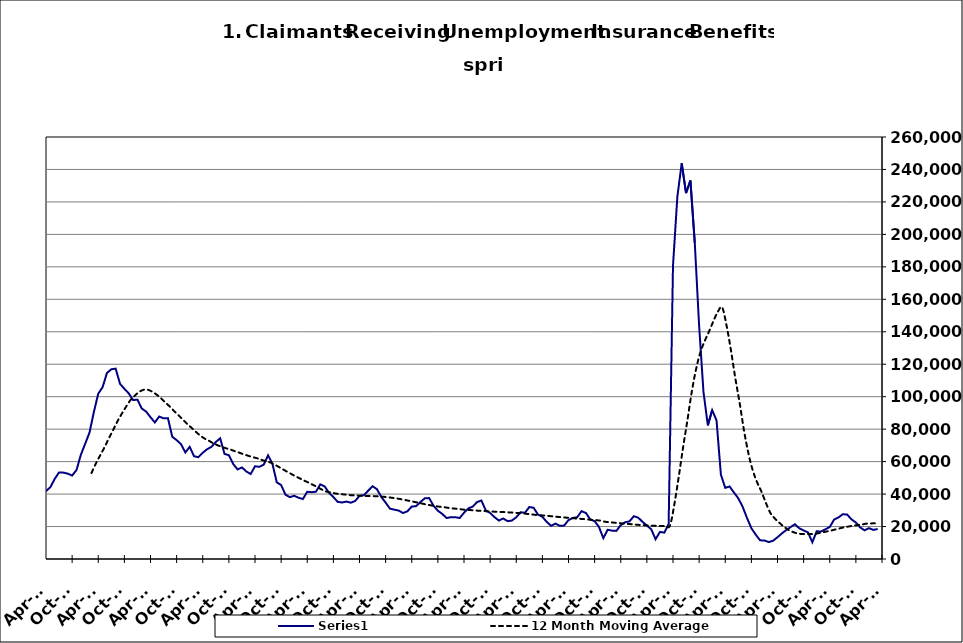
| Category | Series 0 |
|---|---|
| 2000-01-31 | 15239 |
| 2000-02-29 | 13995 |
| 2000-03-31 | 14536 |
| 2000-04-30 | 18337 |
| 2000-05-31 | 20863 |
| 2000-06-30 | 24310 |
| 2000-07-31 | 29359 |
| 2000-08-31 | 29764 |
| 2000-09-30 | 24540 |
| 2000-10-31 | 23067 |
| 2000-11-30 | 21129 |
| 2000-12-31 | 20288 |
| 2001-01-31 | 23646 |
| 2001-02-28 | 23782 |
| 2001-03-31 | 27047 |
| 2001-04-30 | 34048 |
| 2001-05-31 | 38168 |
| 2001-06-30 | 41894 |
| 2001-07-31 | 48114 |
| 2001-08-31 | 47646 |
| 2001-09-30 | 44132 |
| 2001-10-31 | 44465 |
| 2001-11-30 | 45928 |
| 2001-12-31 | 48930 |
| 2002-01-31 | 51864 |
| 2002-02-28 | 50778 |
| 2002-03-31 | 53014 |
| 2002-04-30 | 65394 |
| 2002-05-31 | 67925 |
| 2002-06-30 | 68727 |
| 2002-07-31 | 67269 |
| 2002-08-31 | 64233 |
| 2002-09-30 | 59955 |
| 2002-10-31 | 55535 |
| 2002-11-30 | 52233 |
| 2002-12-31 | 52252 |
| 2003-01-31 | 52694 |
| 2003-02-28 | 52578 |
| 2003-03-31 | 56236 |
| 2003-04-30 | 61020 |
| 2003-05-31 | 60584 |
| 2003-06-30 | 64980 |
| 2003-07-31 | 66426 |
| 2003-08-31 | 65403 |
| 2003-09-30 | 58348 |
| 2003-10-31 | 53953 |
| 2003-11-30 | 50453 |
| 2003-12-31 | 47799 |
| 2004-01-31 | 47134 |
| 2004-02-29 | 42441 |
| 2004-03-31 | 39363 |
| 2004-04-30 | 41157 |
| 2004-05-31 | 40892 |
| 2004-06-30 | 43601 |
| 2004-07-31 | 45411 |
| 2004-08-31 | 44738 |
| 2004-09-30 | 36049 |
| 2004-10-31 | 33551 |
| 2004-11-30 | 31386 |
| 2004-12-31 | 30195 |
| 2005-01-31 | 31661 |
| 2005-02-28 | 28205 |
| 2005-03-31 | 28194 |
| 2005-04-30 | 31233 |
| 2005-05-31 | 24184 |
| 2005-06-30 | 33525 |
| 2005-07-31 | 35776 |
| 2005-08-31 | 33297 |
| 2005-09-30 | 27423 |
| 2005-10-31 | 25647 |
| 2005-11-30 | 21039 |
| 2005-12-31 | 21238 |
| 2006-01-31 | 22270 |
| 2006-02-28 | 19689 |
| 2006-03-31 | 19474 |
| 2006-04-30 | 22420 |
| 2006-05-31 | 24146 |
| 2006-06-30 | 26450 |
| 2006-07-31 | 30575 |
| 2006-08-31 | 30038 |
| 2006-09-30 | 25657 |
| 2006-10-31 | 24869 |
| 2006-11-30 | 22832 |
| 2006-12-31 | 22826 |
| 2007-01-31 | 24459 |
| 2007-02-28 | 23856 |
| 2007-03-31 | 24786 |
| 2007-04-30 | 29690 |
| 2007-05-31 | 31303 |
| 2007-06-30 | 33512 |
| 2007-07-31 | 39176 |
| 2007-08-31 | 37077 |
| 2007-09-30 | 34179 |
| 2007-10-31 | 32130 |
| 2007-11-15 | 31205 |
| 2007-12-15 09:36:00 | 31973 |
| 2008-01-14 19:12:00 | 33494 |
| 2008-02-14 04:48:00 | 34694 |
| 2008-03-15 14:24:00 | 37279 |
| 2008-04-15 | 41840 |
| 2008-05-15 09:36:00 | 44245 |
| 2008-06-14 19:12:00 | 49341 |
| 2008-07-15 04:48:00 | 53353 |
| 2008-08-14 14:24:00 | 53222 |
| 2008-09-14 | 52594 |
| 2008-10-14 09:36:00 | 51417 |
| 2008-11-13 19:12:00 | 54795 |
| 2008-12-14 04:48:00 | 64139 |
| 2009-01-13 14:24:00 | 71026 |
| 2009-02-13 | 77947 |
| 2009-03-15 09:36:00 | 90649 |
| 2009-04-14 19:12:00 | 101865 |
| 2009-05-15 04:48:00 | 105867 |
| 2009-06-14 14:24:00 | 114626 |
| 2009-07-15 | 116882 |
| 2009-08-14 09:36:00 | 117270 |
| 2009-09-13 19:12:00 | 107943 |
| 2009-10-14 04:48:00 | 104849 |
| 2009-11-13 14:24:00 | 102065 |
| 2009-12-14 | 97917 |
| 2010-01-13 09:36:00 | 98175 |
| 2010-02-12 19:12:00 | 92691 |
| 2010-03-15 04:48:00 | 90832 |
| 2010-04-14 14:24:00 | 87347 |
| 2010-05-15 | 84120 |
| 2010-06-14 09:36:00 | 87787 |
| 2010-07-14 19:12:00 | 86654 |
| 2010-08-14 04:48:00 | 86789 |
| 2010-09-13 14:24:00 | 75317 |
| 2010-10-14 | 73259 |
| 2010-11-13 09:36:00 | 70783 |
| 2010-12-13 19:12:00 | 65644 |
| 2011-01-13 04:48:00 | 69106 |
| 2011-02-12 14:24:00 | 63322 |
| 2011-03-15 | 62724 |
| 2011-04-14 09:36:00 | 65434 |
| 2011-05-14 19:12:00 | 67641 |
| 2011-06-14 04:48:00 | 69087 |
| 2011-07-14 14:24:00 | 72082 |
| 2011-08-14 | 74376 |
| 2011-09-13 09:36:00 | 64739 |
| 2011-10-13 19:12:00 | 63965 |
| 2011-11-13 04:48:00 | 58496 |
| 2011-12-13 14:24:00 | 55173 |
| 2012-01-13 | 56418 |
| 2012-02-12 09:36:00 | 53942 |
| 2012-03-13 19:12:00 | 52352 |
| 2012-04-13 04:48:00 | 57118 |
| 2012-05-13 14:24:00 | 56827 |
| 2012-06-13 | 58115 |
| 2012-07-13 09:36:00 | 63863 |
| 2012-08-12 19:12:00 | 58706 |
| 2012-09-12 04:48:00 | 47243 |
| 2012-10-12 14:24:00 | 45567 |
| 2012-11-12 | 39623 |
| 2012-12-12 09:36:00 | 38101 |
| 2013-01-11 19:12:00 | 38966 |
| 2013-02-11 04:48:00 | 37746 |
| 2013-03-13 14:24:00 | 36956 |
| 2013-04-13 | 41439 |
| 2013-05-13 09:36:00 | 41162 |
| 2013-06-12 19:12:00 | 41455 |
| 2013-07-13 04:48:00 | 45989 |
| 2013-08-12 14:24:00 | 44712 |
| 2013-09-12 | 40828 |
| 2013-10-12 09:36:00 | 38185 |
| 2013-11-11 19:12:00 | 35184 |
| 2013-12-12 04:48:00 | 34824 |
| 2014-01-11 14:24:00 | 35396 |
| 2014-02-11 | 34683 |
| 2014-03-13 09:36:00 | 35748 |
| 2014-04-12 19:12:00 | 38892 |
| 2014-05-13 04:48:00 | 39325 |
| 2014-06-12 14:24:00 | 42091 |
| 2014-07-13 | 44842 |
| 2014-08-14 | 43016 |
| 2014-09-13 09:36:00 | 38304 |
| 2014-10-13 19:12:00 | 34708 |
| 2014-11-13 04:48:00 | 31017 |
| 2014-12-13 14:24:00 | 30402 |
| 2015-01-13 | 29823 |
| 2015-02-12 09:36:00 | 28333 |
| 2015-03-14 19:12:00 | 29389 |
| 2015-04-14 04:48:00 | 32293 |
| 2015-05-14 14:24:00 | 32538 |
| 2015-06-14 | 35137 |
| 2015-07-14 09:36:00 | 37398 |
| 2015-08-13 19:12:00 | 37536 |
| 2015-09-13 04:48:00 | 32808 |
| 2015-10-13 14:24:00 | 29728 |
| 2015-11-13 | 27775 |
| 2015-12-13 09:36:00 | 25227 |
| 2016-01-12 19:12:00 | 25773 |
| 2016-02-12 04:48:00 | 25758 |
| 2016-03-13 14:24:00 | 25247 |
| 2016-04-13 | 28463 |
| 2016-05-13 09:36:00 | 31210 |
| 2016-06-12 19:12:00 | 32255 |
| 2016-07-13 04:48:00 | 35088 |
| 2016-08-12 14:24:00 | 36018 |
| 2016-09-12 | 29922 |
| 2016-10-12 09:36:00 | 28368 |
| 2016-11-11 19:12:00 | 25818 |
| 2016-12-12 04:48:00 | 23690 |
| 2017-01-11 14:24:00 | 24964 |
| 2017-02-11 | 23348 |
| 2017-03-13 09:36:00 | 23685 |
| 2017-04-12 19:12:00 | 25733 |
| 2017-05-13 04:48:00 | 28796 |
| 2017-06-12 14:24:00 | 28489 |
| 2017-07-13 | 32034 |
| 2017-08-12 09:36:00 | 31539 |
| 2017-09-11 19:12:00 | 27321 |
| 2017-10-12 04:48:00 | 25990 |
| 2017-11-11 14:24:00 | 22875 |
| 2017-12-12 | 20445 |
| 2018-01-11 09:36:00 | 21794 |
| 2018-02-10 19:12:00 | 20475 |
| 2018-03-13 04:48:00 | 20585 |
| 2018-04-12 14:24:00 | 23969 |
| 2018-05-13 | 25280 |
| 2018-06-12 09:36:00 | 25741 |
| 2018-07-12 19:12:00 | 29479 |
| 2018-08-12 04:48:00 | 28351 |
| 2018-09-11 14:24:00 | 24386 |
| 2018-10-12 | 23292 |
| 2018-11-11 09:36:00 | 19711 |
| 2018-12-11 19:12:00 | 12853 |
| 2019-01-11 04:48:00 | 18039 |
| 2019-02-10 14:24:00 | 17466 |
| 2019-03-13 | 17325 |
| 2019-04-12 09:36:00 | 20890 |
| 2019-05-12 19:12:00 | 22641 |
| 2019-06-12 04:48:00 | 23178 |
| 2019-07-12 14:24:00 | 26385 |
| 2019-08-12 | 25501 |
| 2019-09-11 09:36:00 | 22892 |
| 2019-10-11 19:12:00 | 20585 |
| 2019-11-11 04:48:00 | 18323 |
| 2019-12-11 14:24:00 | 12174 |
| 2020-01-11 | 16684 |
| 2020-02-10 09:36:00 | 16260 |
| 2020-03-11 19:12:00 | 21667 |
| 2020-04-11 04:48:00 | 180666 |
| 2020-05-11 14:24:00 | 223189 |
| 2020-06-11 | 243809 |
| 2020-07-11 09:36:00 | 225469 |
| 2020-08-10 19:12:00 | 233220 |
| 2020-09-10 04:48:00 | 194839 |
| 2020-10-10 14:24:00 | 143722 |
| 2020-11-10 | 102967 |
| 2020-12-10 09:36:00 | 82367 |
| 2021-01-09 19:12:00 | 91710 |
| 2021-02-09 04:48:00 | 85397 |
| 2021-03-11 14:24:00 | 51963 |
| 2021-04-11 | 43840 |
| 2021-05-11 09:36:00 | 44687 |
| 2021-06-10 19:12:00 | 40936 |
| 2021-07-11 04:48:00 | 37365 |
| 2021-08-10 14:24:00 | 32159 |
| 2021-09-10 | 25254 |
| 2021-10-10 09:36:00 | 18966 |
| 2021-11-09 19:12:00 | 14997 |
| 2021-12-10 04:48:00 | 11499 |
| 2022-01-09 14:24:00 | 11404 |
| 2022-02-09 | 10424 |
| 2022-03-11 09:36:00 | 11269 |
| 2022-04-10 19:12:00 | 13419 |
| 2022-05-11 04:48:00 | 15755 |
| 2022-06-10 14:24:00 | 17823 |
| 2022-07-11 | 19654 |
| 2022-08-10 09:36:00 | 21418 |
| 2022-09-09 19:12:00 | 18932 |
| 2022-10-10 04:48:00 | 17577 |
| 2022-11-09 14:24:00 | 16421 |
| 2022-12-10 | 10320 |
| 2023-01-09 09:36:00 | 17072 |
| 2023-02-08 19:12:00 | 16921 |
| 2023-03-11 04:48:00 | 18314 |
| 2023-04-10 14:24:00 | 19704 |
| 2023-05-11 | 24285 |
| 2023-06-10 09:36:00 | 25600 |
| 2023-07-10 19:12:00 | 27593 |
| 2023-08-10 04:48:00 | 27363 |
| 2023-09-09 14:24:00 | 24414 |
| 2023-10-10 | 22474 |
| 2023-11-09 09:36:00 | 19433 |
| 2023-12-09 19:12:00 | 17628 |
| 2024-01-09 04:48:00 | 19001 |
| 2024-02-08 14:24:00 | 17917 |
| 2024-03-10 | 18481 |
| 2024-04-09 09:36:00 | 21765 |